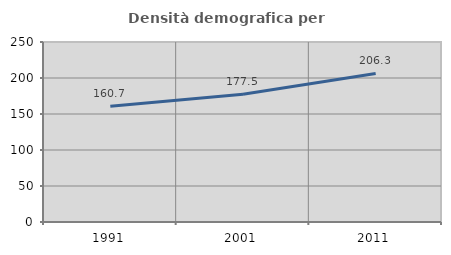
| Category | Densità demografica |
|---|---|
| 1991.0 | 160.677 |
| 2001.0 | 177.465 |
| 2011.0 | 206.263 |